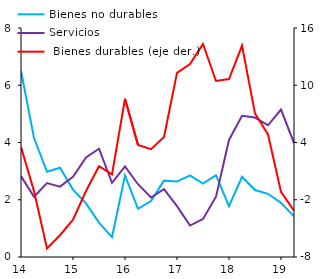
| Category | Bienes no durables | Servicios |
|---|---|---|
| 2014-03-01 | 6.498 | 2.828 |
| 2014-06-01 | 4.157 | 2.104 |
| 2014-09-01 | 2.98 | 2.585 |
| 2014-12-01 | 3.12 | 2.458 |
| 2015-03-01 | 2.354 | 2.804 |
| 2015-06-01 | 1.874 | 3.477 |
| 2015-09-01 | 1.201 | 3.782 |
| 2015-12-01 | 0.694 | 2.592 |
| 2016-03-01 | 2.849 | 3.167 |
| 2016-06-01 | 1.685 | 2.542 |
| 2016-09-01 | 1.956 | 2.077 |
| 2016-12-01 | 2.668 | 2.373 |
| 2017-03-01 | 2.635 | 1.779 |
| 2017-06-01 | 2.852 | 1.099 |
| 2017-09-01 | 2.562 | 1.328 |
| 2017-12-01 | 2.858 | 2.106 |
| 2018-03-01 | 1.776 | 4.088 |
| 2018-06-01 | 2.803 | 4.934 |
| 2018-09-01 | 2.34 | 4.871 |
| 2018-12-01 | 2.208 | 4.601 |
| 2019-03-01 | 1.891 | 5.152 |
| 2019-06-02 | 1.419 | 3.982 |